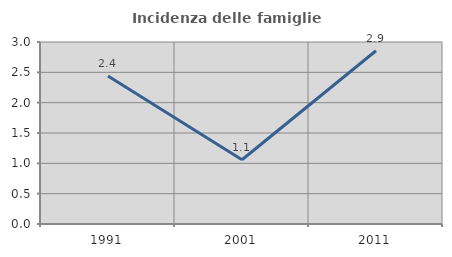
| Category | Incidenza delle famiglie numerose |
|---|---|
| 1991.0 | 2.439 |
| 2001.0 | 1.059 |
| 2011.0 | 2.856 |